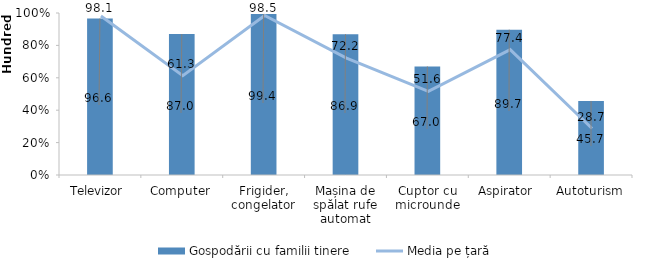
| Category | Gospodării cu familii tinere |
|---|---|
| Televizor | 96.6 |
| Computer | 87 |
| Frigider, congelator | 99.4 |
| Mașina de spălat rufe automat | 86.9 |
| Cuptor cu microunde | 67 |
| Aspirator  | 89.7 |
| Autoturism | 45.7 |